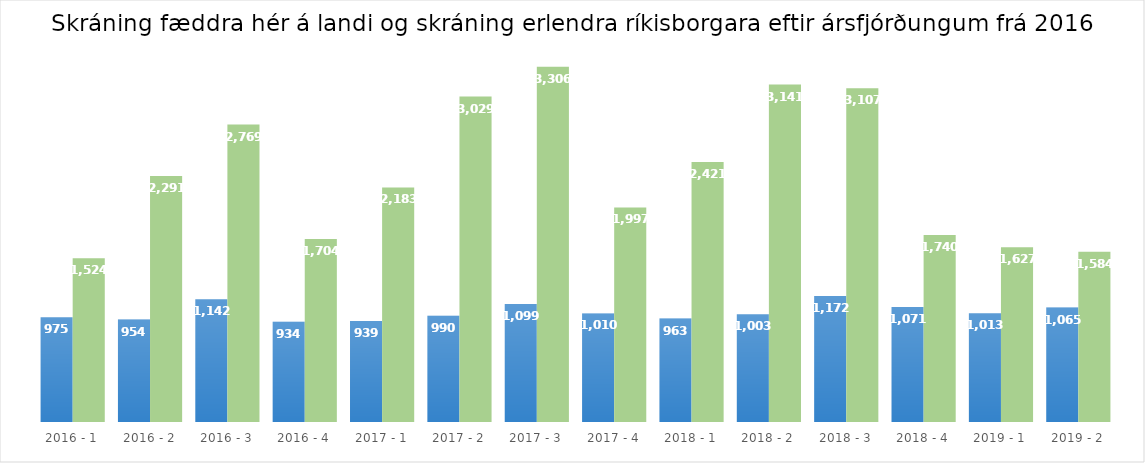
| Category | Skráning fæddra | Skráning erlendra |
|---|---|---|
| 2016 - 1 | 975 | 1524 |
| 2016 - 2 | 954 | 2291 |
| 2016 - 3 | 1142 | 2769 |
| 2016 - 4 | 934 | 1704 |
| 2017 - 1 | 939 | 2183 |
| 2017 - 2 | 990 | 3029 |
| 2017 - 3 | 1099 | 3306 |
| 2017 - 4 | 1010 | 1997 |
| 2018 - 1 | 963 | 2421 |
| 2018 - 2 | 1003 | 3141 |
| 2018 - 3 | 1172 | 3107 |
| 2018 - 4 | 1071 | 1740 |
| 2019 - 1 | 1013 | 1627 |
| 2019 - 2 | 1065 | 1584 |